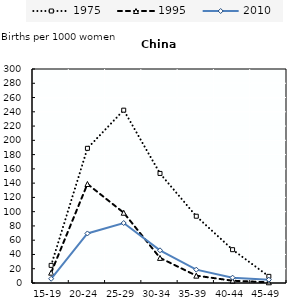
| Category | 1975 | 1995 | 2010 |
|---|---|---|---|
| 15-19 | 24.7 | 14.5 | 5.93 |
| 20-24 | 188.8 | 138.8 | 69.47 |
| 25-29 | 242.3 | 98.5 | 84.08 |
| 30-34 | 153.6 | 35.2 | 45.84 |
| 35-39 | 93.6 | 10.3 | 18.71 |
| 40-44 | 46.7 | 3.2 | 7.51 |
| 45-49 | 9.3 | 1 | 4.68 |